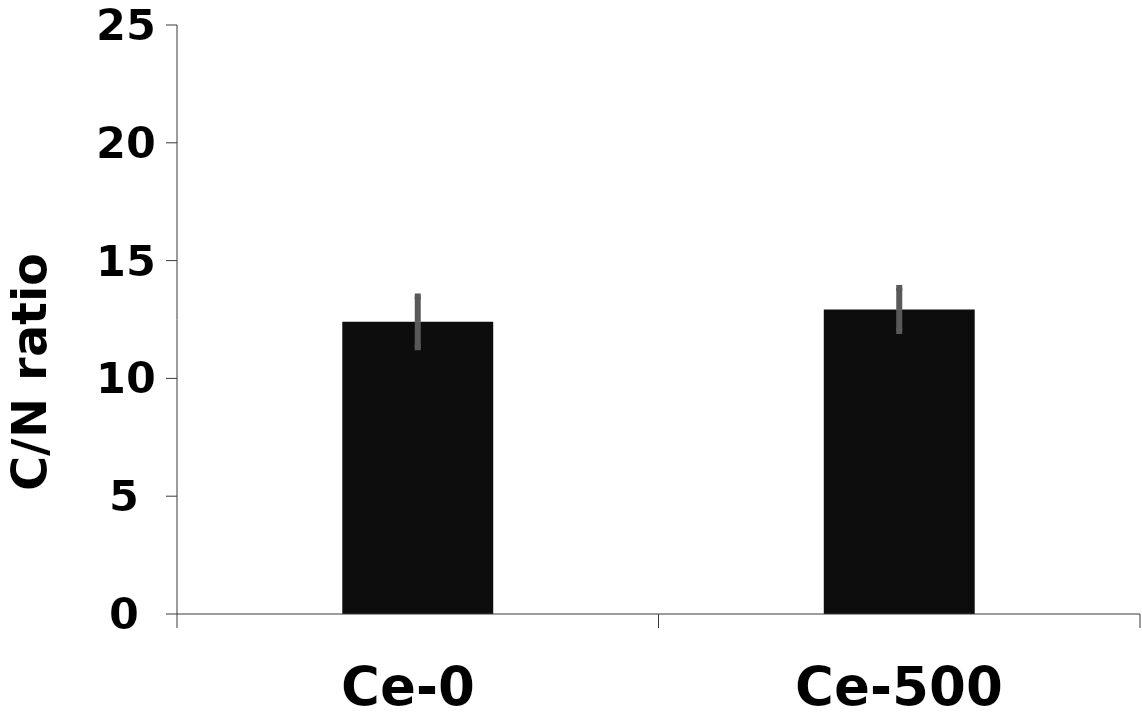
| Category | C/N |
|---|---|
| Ce-0 | 12.4 |
| Ce-500 | 12.926 |